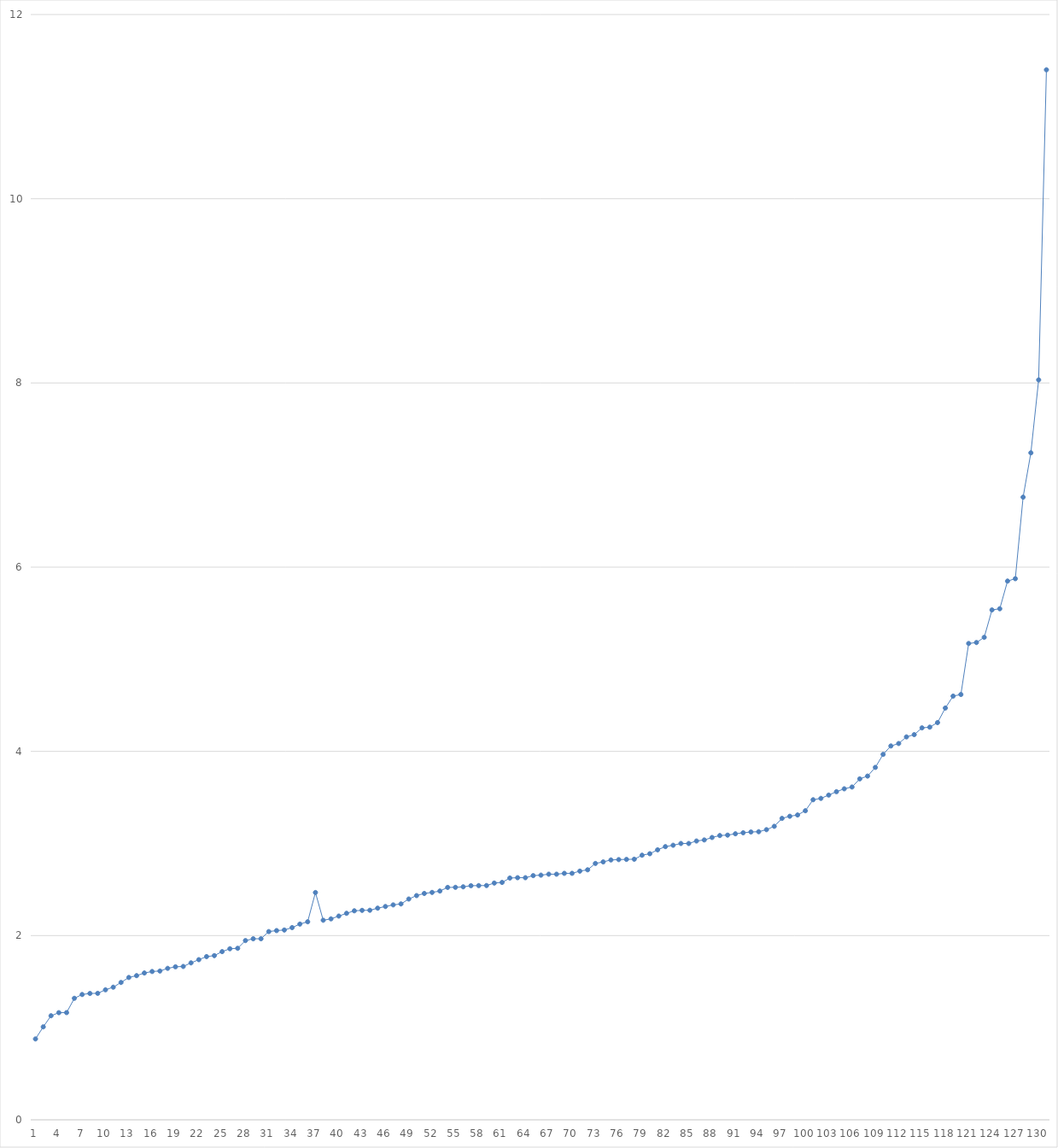
| Category | Series 0 |
|---|---|
| 0 | 0.878 |
| 1 | 1.009 |
| 2 | 1.13 |
| 3 | 1.163 |
| 4 | 1.164 |
| 5 | 1.319 |
| 6 | 1.36 |
| 7 | 1.372 |
| 8 | 1.373 |
| 9 | 1.412 |
| 10 | 1.44 |
| 11 | 1.491 |
| 12 | 1.545 |
| 13 | 1.565 |
| 14 | 1.594 |
| 15 | 1.61 |
| 16 | 1.615 |
| 17 | 1.644 |
| 18 | 1.661 |
| 19 | 1.665 |
| 20 | 1.704 |
| 21 | 1.739 |
| 22 | 1.772 |
| 23 | 1.783 |
| 24 | 1.826 |
| 25 | 1.857 |
| 26 | 1.862 |
| 27 | 1.946 |
| 28 | 1.966 |
| 29 | 1.966 |
| 30 | 2.043 |
| 31 | 2.054 |
| 32 | 2.061 |
| 33 | 2.087 |
| 34 | 2.125 |
| 35 | 2.15 |
| 36 | 2.468 |
| 37 | 2.167 |
| 38 | 2.182 |
| 39 | 2.212 |
| 40 | 2.242 |
| 41 | 2.269 |
| 42 | 2.274 |
| 43 | 2.275 |
| 44 | 2.298 |
| 45 | 2.316 |
| 46 | 2.333 |
| 47 | 2.344 |
| 48 | 2.397 |
| 49 | 2.434 |
| 50 | 2.458 |
| 51 | 2.469 |
| 52 | 2.484 |
| 53 | 2.523 |
| 54 | 2.524 |
| 55 | 2.529 |
| 56 | 2.542 |
| 57 | 2.543 |
| 58 | 2.543 |
| 59 | 2.57 |
| 60 | 2.577 |
| 61 | 2.625 |
| 62 | 2.629 |
| 63 | 2.629 |
| 64 | 2.651 |
| 65 | 2.656 |
| 66 | 2.667 |
| 67 | 2.667 |
| 68 | 2.676 |
| 69 | 2.676 |
| 70 | 2.7 |
| 71 | 2.714 |
| 72 | 2.783 |
| 73 | 2.8 |
| 74 | 2.821 |
| 75 | 2.825 |
| 76 | 2.827 |
| 77 | 2.829 |
| 78 | 2.873 |
| 79 | 2.889 |
| 80 | 2.931 |
| 81 | 2.966 |
| 82 | 2.981 |
| 83 | 3 |
| 84 | 3 |
| 85 | 3.027 |
| 86 | 3.038 |
| 87 | 3.065 |
| 88 | 3.086 |
| 89 | 3.091 |
| 90 | 3.105 |
| 91 | 3.116 |
| 92 | 3.125 |
| 93 | 3.128 |
| 94 | 3.15 |
| 95 | 3.186 |
| 96 | 3.273 |
| 97 | 3.295 |
| 98 | 3.31 |
| 99 | 3.356 |
| 100 | 3.475 |
| 101 | 3.49 |
| 102 | 3.526 |
| 103 | 3.562 |
| 104 | 3.594 |
| 105 | 3.613 |
| 106 | 3.701 |
| 107 | 3.732 |
| 108 | 3.826 |
| 109 | 3.968 |
| 110 | 4.059 |
| 111 | 4.085 |
| 112 | 4.157 |
| 113 | 4.182 |
| 114 | 4.255 |
| 115 | 4.263 |
| 116 | 4.312 |
| 117 | 4.471 |
| 118 | 4.6 |
| 119 | 4.618 |
| 120 | 5.171 |
| 121 | 5.182 |
| 122 | 5.238 |
| 123 | 5.536 |
| 124 | 5.548 |
| 125 | 5.849 |
| 126 | 5.875 |
| 127 | 6.76 |
| 128 | 7.241 |
| 129 | 8.033 |
| 130 | 11.4 |